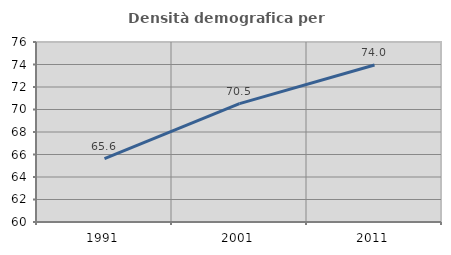
| Category | Densità demografica |
|---|---|
| 1991.0 | 65.633 |
| 2001.0 | 70.527 |
| 2011.0 | 73.959 |